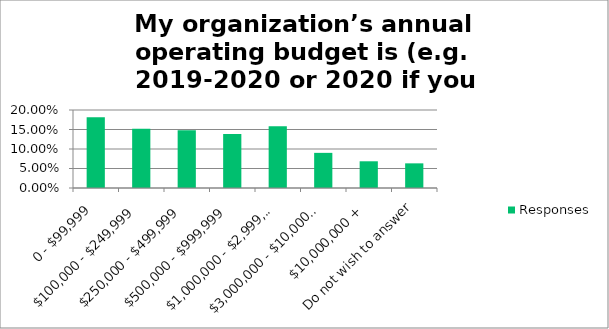
| Category | Responses |
|---|---|
| 0 - $99,999 | 0.182 |
| $100,000 - $249,999 | 0.152 |
| $250,000 - $499,999 | 0.148 |
| $500,000 - $999,999 | 0.138 |
| $1,000,000 - $2,999,999 | 0.159 |
| $3,000,000 - $10,000,000 | 0.09 |
| $10,000,000 + | 0.068 |
| Do not wish to answer | 0.063 |